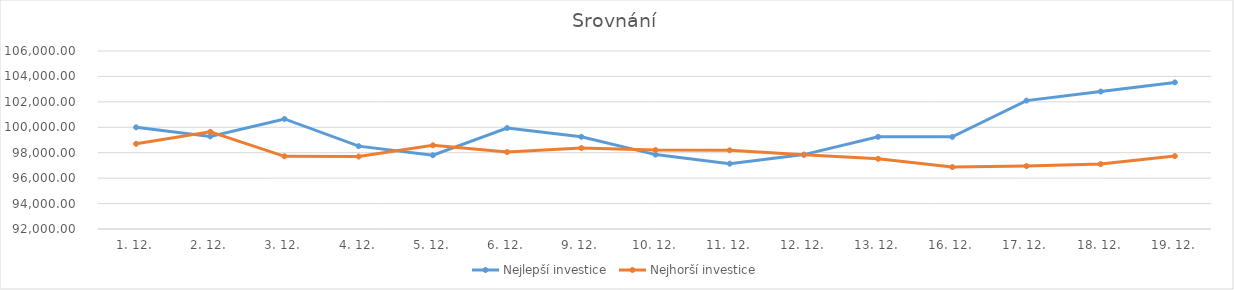
| Category | Nejlepší investice | Nejhorší investice |
|---|---|---|
| 1. 12. | 100000 | 98698.891 |
| 2. 12. | 99282.231 | 99645.937 |
| 3. 12. | 100654.606 | 97717.059 |
| 4. 12. | 98515.875 | 97697.509 |
| 5. 12. | 97802.964 | 98583.746 |
| 6. 12. | 99941.696 | 98051.572 |
| 9. 12. | 99253.079 | 98366.535 |
| 10. 12. | 97851.551 | 98207.975 |
| 11. 12. | 97138.641 | 98190.582 |
| 12. 12. | 97851.551 | 97834.361 |
| 13. 12. | 99248.22 | 97519.399 |
| 16. 12. | 99248.22 | 96869.923 |
| 17. 12. | 102099.862 | 96948.124 |
| 18. 12. | 102812.772 | 97104.527 |
| 19. 12. | 103530.541 | 97734.452 |